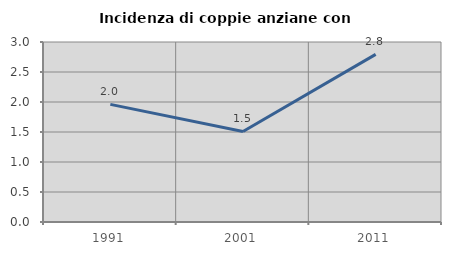
| Category | Incidenza di coppie anziane con figli |
|---|---|
| 1991.0 | 1.961 |
| 2001.0 | 1.509 |
| 2011.0 | 2.794 |